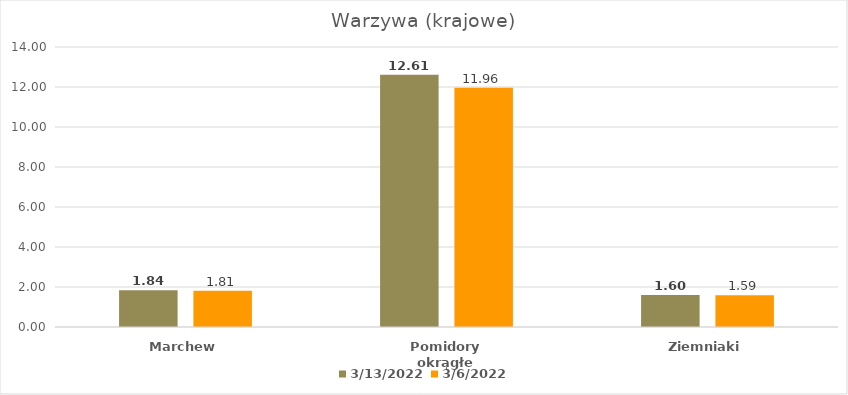
| Category | 13.03.2022 | 06.03.2022 |
|---|---|---|
| Marchew | 1.84 | 1.81 |
| Pomidory okrągłe | 12.61 | 11.96 |
| Ziemniaki | 1.6 | 1.59 |